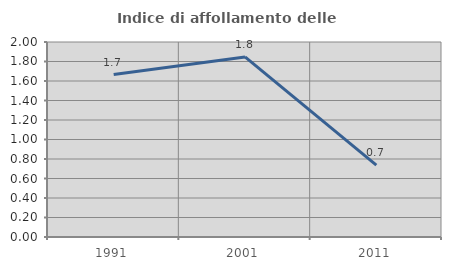
| Category | Indice di affollamento delle abitazioni  |
|---|---|
| 1991.0 | 1.667 |
| 2001.0 | 1.847 |
| 2011.0 | 0.737 |